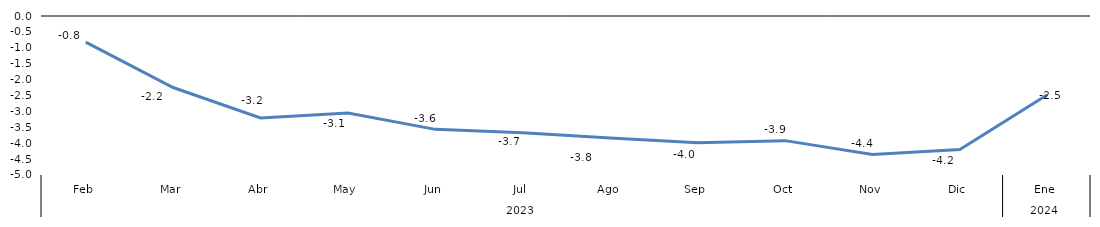
| Category | Bogotá |
|---|---|
| 0 | -0.821 |
| 1 | -2.248 |
| 2 | -3.206 |
| 3 | -3.05 |
| 4 | -3.565 |
| 5 | -3.673 |
| 6 | -3.838 |
| 7 | -3.985 |
| 8 | -3.919 |
| 9 | -4.352 |
| 10 | -4.201 |
| 11 | -2.475 |